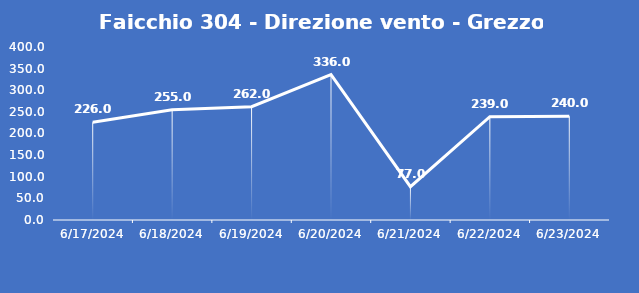
| Category | Faicchio 304 - Direzione vento - Grezzo (°N) |
|---|---|
| 6/17/24 | 226 |
| 6/18/24 | 255 |
| 6/19/24 | 262 |
| 6/20/24 | 336 |
| 6/21/24 | 77 |
| 6/22/24 | 239 |
| 6/23/24 | 240 |